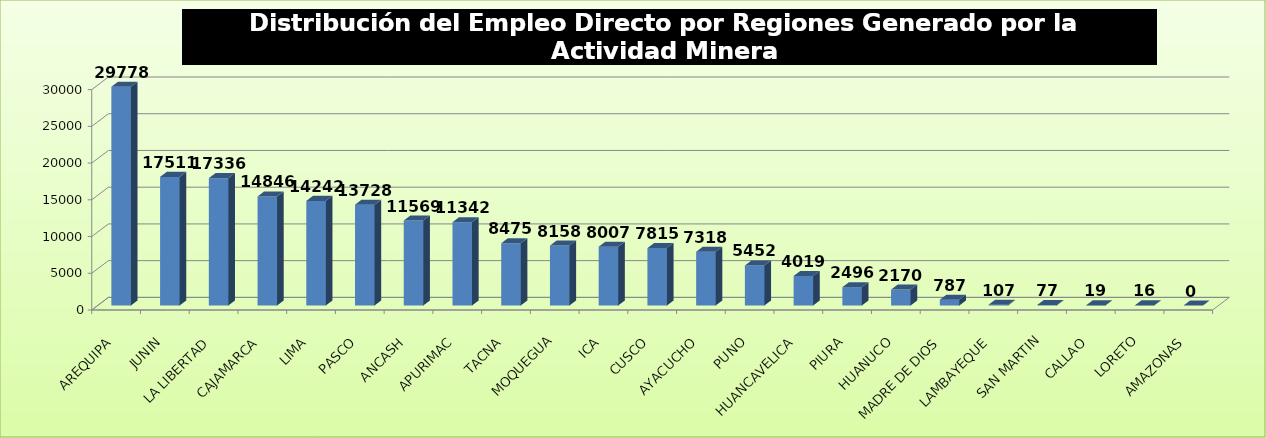
| Category | Series 0 |
|---|---|
| AREQUIPA | 29778 |
| JUNIN | 17511 |
| LA LIBERTAD | 17336 |
| CAJAMARCA | 14846 |
| LIMA | 14242 |
| PASCO | 13728 |
| ANCASH | 11569 |
| APURIMAC | 11342 |
| TACNA | 8475 |
| MOQUEGUA | 8158 |
| ICA | 8007 |
| CUSCO | 7815 |
| AYACUCHO | 7318 |
| PUNO | 5452 |
| HUANCAVELICA | 4019 |
| PIURA | 2496 |
| HUANUCO | 2170 |
| MADRE DE DIOS | 787 |
| LAMBAYEQUE | 107 |
| SAN MARTIN | 77 |
| CALLAO | 19 |
| LORETO | 16 |
| AMAZONAS | 0 |